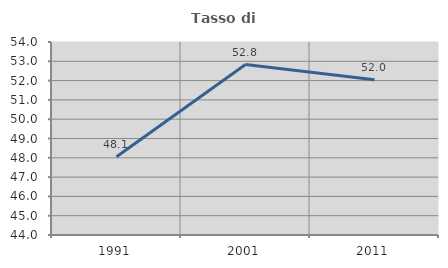
| Category | Tasso di occupazione   |
|---|---|
| 1991.0 | 48.054 |
| 2001.0 | 52.834 |
| 2011.0 | 52.048 |